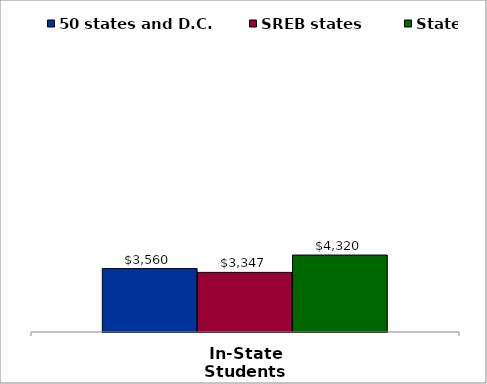
| Category | 50 states and D.C. | SREB states | State |
|---|---|---|---|
| In-State Students | 3560 | 3347 | 4320 |